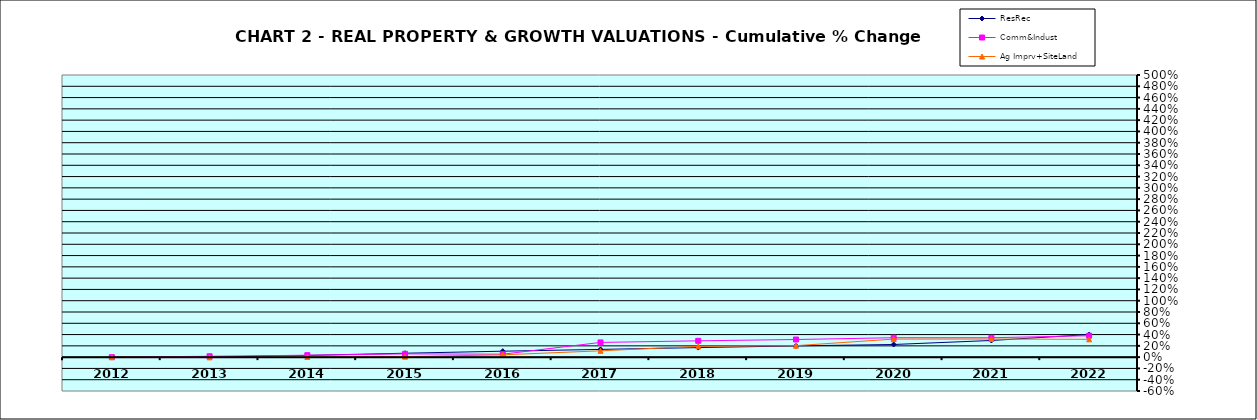
| Category | ResRec | Comm&Indust | Ag Imprv+SiteLand |
|---|---|---|---|
| 2012.0 | 0 | 0 | 0 |
| 2013.0 | 0.001 | 0.015 | -0.004 |
| 2014.0 | 0.031 | 0.034 | 0.003 |
| 2015.0 | 0.069 | 0.058 | 0.009 |
| 2016.0 | 0.105 | 0.052 | 0.041 |
| 2017.0 | 0.137 | 0.261 | 0.112 |
| 2018.0 | 0.169 | 0.289 | 0.192 |
| 2019.0 | 0.2 | 0.312 | 0.203 |
| 2020.0 | 0.224 | 0.344 | 0.32 |
| 2021.0 | 0.295 | 0.344 | 0.321 |
| 2022.0 | 0.4 | 0.38 | 0.316 |